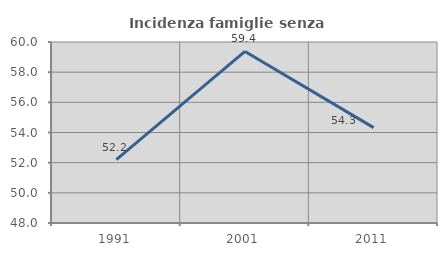
| Category | Incidenza famiglie senza nuclei |
|---|---|
| 1991.0 | 52.201 |
| 2001.0 | 59.375 |
| 2011.0 | 54.321 |